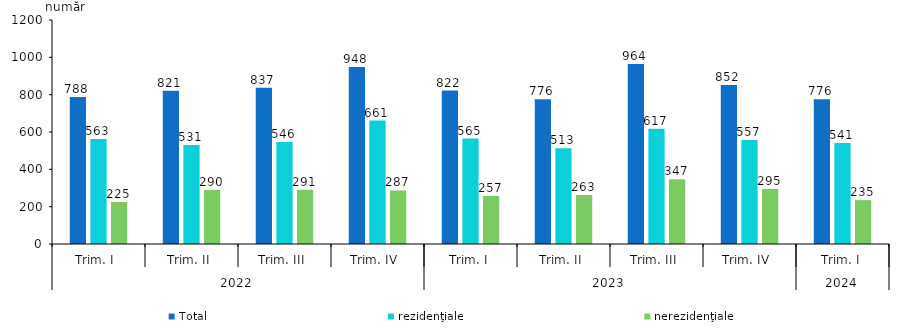
| Category | Total | rezidenţiale | nerezidenţiale |
|---|---|---|---|
| 0 | 788 | 563 | 225 |
| 1 | 821 | 531 | 290 |
| 2 | 837 | 546 | 291 |
| 3 | 948 | 661 | 287 |
| 4 | 822 | 565 | 257 |
| 5 | 776 | 513 | 263 |
| 6 | 964 | 617 | 347 |
| 7 | 852 | 557 | 295 |
| 8 | 776 | 541 | 235 |